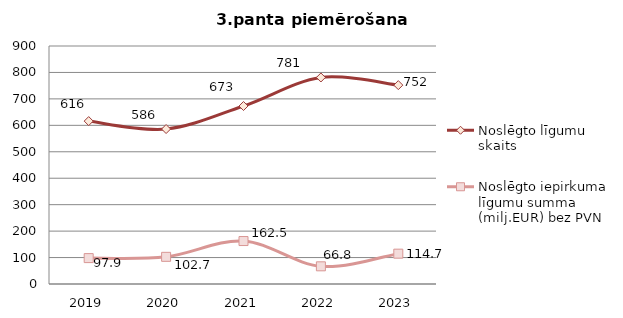
| Category | Noslēgto līgumu skaits | Noslēgto iepirkuma līgumu summa (milj.EUR) bez PVN |
|---|---|---|
| 2019.0 | 616 | 97.928 |
| 2020.0 | 586 | 102.745 |
| 2021.0 | 673 | 162.472 |
| 2022.0 | 781 | 66.849 |
| 2023.0 | 752 | 114.72 |